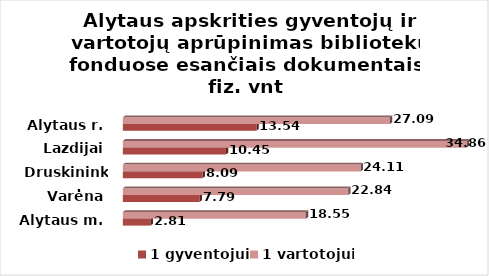
| Category | 1 gyventojui | 1 vartotojui |
|---|---|---|
| Alytaus m. | 2.81 | 18.55 |
| Varėna | 7.79 | 22.84 |
| Druskininkai | 8.09 | 24.11 |
| Lazdijai | 10.45 | 34.86 |
| Alytaus r. | 13.54 | 27.09 |